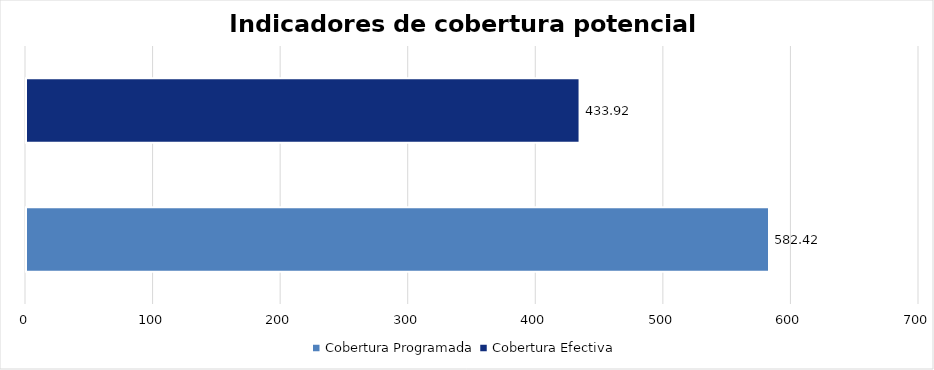
| Category | Series 0 |
|---|---|
| Cobertura Programada | 582.418 |
| Cobertura Efectiva | 433.919 |